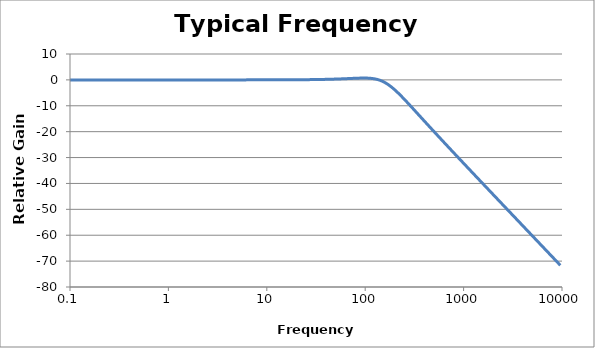
| Category | Relative Gain (dB) |
|---|---|
| 0.1 | 0 |
| 0.10391223 | 0 |
| 0.10797752 | 0 |
| 0.11220184999999999 | 0 |
| 0.11659144 | 0 |
| 0.12115277 | 0 |
| 0.12589254 | 0 |
| 0.13081774999999998 | 0 |
| 0.13593564 | 0 |
| 0.14125374999999998 | 0 |
| 0.14677993 | 0 |
| 0.1525223 | 0 |
| 0.15848932 | 0 |
| 0.16468978999999997 | 0 |
| 0.17113283 | 0 |
| 0.17782794000000002 | 0 |
| 0.18478498 | 0 |
| 0.19201419 | 0 |
| 0.19952623 | 0 |
| 0.20733216 | 0 |
| 0.21544347 | 0 |
| 0.22387210999999999 | 0 |
| 0.23263050999999998 | 0 |
| 0.24173155 | 0 |
| 0.25118864 | 0 |
| 0.26101572 | 0 |
| 0.27122726 | 0 |
| 0.28183829 | 0 |
| 0.29286446 | 0 |
| 0.30432199000000004 | 0 |
| 0.31622777 | 0 |
| 0.32859932 | 0 |
| 0.34145488999999996 | 0 |
| 0.35481339 | 0 |
| 0.36869451 | 0 |
| 0.38311868 | 0 |
| 0.39810717 | 0 |
| 0.41368204 | 0 |
| 0.42986622999999996 | 0 |
| 0.44668358999999996 | 0 |
| 0.46415888 | 0 |
| 0.48231785000000005 | 0 |
| 0.50118723 | 0 |
| 0.52079483 | 0 |
| 0.54116953 | 0 |
| 0.56234133 | 0 |
| 0.58434141 | 0 |
| 0.6072021999999999 | 0 |
| 0.63095734 | 0 |
| 0.65564185 | 0 |
| 0.6812920699999999 | 0 |
| 0.70794578 | 0 |
| 0.7356422499999999 | 0 |
| 0.7644222700000001 | 0 |
| 0.79432823 | 0 |
| 0.82540419 | 0 |
| 0.8576959000000001 | 0 |
| 0.89125094 | 0 |
| 0.92611873 | 0 |
| 0.96235063 | 0 |
| 1.0 | 0 |
| 1.0391223 | 0 |
| 1.0797751599999998 | 0 |
| 1.1220184500000001 | 0 |
| 1.1659144 | 0 |
| 1.21152766 | 0 |
| 1.25892541 | 0 |
| 1.3081774700000002 | 0 |
| 1.3593563899999999 | 0 |
| 1.41253754 | 0 |
| 1.46779927 | 0 |
| 1.52522296 | 0 |
| 1.58489319 | 0 |
| 1.64689787 | 0 |
| 1.7113283 | 0 |
| 1.7782794100000001 | 0 |
| 1.8478497999999999 | 0 |
| 1.92014194 | 0.001 |
| 1.99526231 | 0.001 |
| 2.07332157 | 0.001 |
| 2.15443469 | 0.001 |
| 2.23872114 | 0.001 |
| 2.32630507 | 0.001 |
| 2.41731548 | 0.001 |
| 2.51188643 | 0.001 |
| 2.61015722 | 0.001 |
| 2.71227258 | 0.001 |
| 2.8183829300000003 | 0.001 |
| 2.9286445600000004 | 0.001 |
| 3.04321989 | 0.001 |
| 3.16227766 | 0.001 |
| 3.28599325 | 0.002 |
| 3.41454887 | 0.002 |
| 3.54813389 | 0.002 |
| 3.68694506 | 0.002 |
| 3.83118685 | 0.002 |
| 3.98107171 | 0.002 |
| 4.1368203999999995 | 0.002 |
| 4.29866235 | 0.003 |
| 4.46683592 | 0.003 |
| 4.64158883 | 0.003 |
| 4.823178479999999 | 0.003 |
| 5.01187234 | 0.003 |
| 5.20794833 | 0.004 |
| 5.41169527 | 0.004 |
| 5.62341325 | 0.004 |
| 5.84341413 | 0.005 |
| 6.07202196 | 0.005 |
| 6.30957344 | 0.006 |
| 6.55641849 | 0.006 |
| 6.81292069 | 0.006 |
| 7.07945784 | 0.007 |
| 7.35642254 | 0.008 |
| 7.64422274 | 0.008 |
| 7.9432823500000005 | 0.009 |
| 8.25404185 | 0.009 |
| 8.57695899 | 0.01 |
| 8.91250938 | 0.011 |
| 9.26118728 | 0.012 |
| 9.623506260000001 | 0.013 |
| 10.0 | 0.014 |
| 10.391223040000002 | 0.015 |
| 10.79775162 | 0.016 |
| 11.22018454 | 0.017 |
| 11.65914401 | 0.019 |
| 12.115276589999999 | 0.02 |
| 12.58925412 | 0.022 |
| 13.08177474 | 0.024 |
| 13.59356391 | 0.025 |
| 14.12537545 | 0.028 |
| 14.67799268 | 0.03 |
| 15.252229569999999 | 0.032 |
| 15.84893192 | 0.035 |
| 16.46897865 | 0.037 |
| 17.11328304 | 0.04 |
| 17.7827941 | 0.043 |
| 18.47849797 | 0.047 |
| 19.201419389999998 | 0.05 |
| 19.95262315 | 0.054 |
| 20.73321573 | 0.059 |
| 21.5443469 | 0.063 |
| 22.38721139 | 0.068 |
| 23.263050670000002 | 0.074 |
| 24.17315481 | 0.079 |
| 25.11886432 | 0.086 |
| 26.10157216 | 0.092 |
| 27.12272579 | 0.099 |
| 28.18382931 | 0.107 |
| 29.28644565 | 0.115 |
| 30.43219887 | 0.124 |
| 31.6227766 | 0.134 |
| 32.859932480000005 | 0.144 |
| 34.14548874 | 0.155 |
| 35.48133892 | 0.166 |
| 36.86945065 | 0.179 |
| 38.311868499999996 | 0.192 |
| 39.81071706 | 0.206 |
| 41.36820402 | 0.222 |
| 42.98662347 | 0.238 |
| 44.66835922 | 0.255 |
| 46.415888339999995 | 0.273 |
| 48.23178482 | 0.293 |
| 50.118723360000004 | 0.313 |
| 52.07948329 | 0.335 |
| 54.11695265 | 0.358 |
| 56.234132519999996 | 0.382 |
| 58.434141340000004 | 0.407 |
| 60.72021957 | 0.433 |
| 63.09573445 | 0.46 |
| 65.56418494 | 0.487 |
| 68.12920691 | 0.515 |
| 70.79457844 | 0.544 |
| 73.56422545 | 0.572 |
| 76.44222743 | 0.599 |
| 79.43282347 | 0.626 |
| 82.54041853 | 0.65 |
| 85.76958986 | 0.672 |
| 89.12509381000001 | 0.69 |
| 92.61187281 | 0.703 |
| 96.23506264000001 | 0.709 |
| 100.0 | 0.706 |
| 103.91223038 | 0.693 |
| 107.97751622999999 | 0.666 |
| 112.20184543 | 0.623 |
| 116.59144012 | 0.561 |
| 121.15276586 | 0.476 |
| 125.89254118 | 0.365 |
| 130.81774743 | 0.224 |
| 135.93563909000002 | 0.05 |
| 141.25375446 | -0.16 |
| 146.77992676 | -0.409 |
| 152.52229565 | -0.698 |
| 158.48931925 | -1.029 |
| 164.68978654999998 | -1.402 |
| 171.13283042 | -1.815 |
| 177.82794099999998 | -2.268 |
| 184.78497974 | -2.757 |
| 192.01419386 | -3.279 |
| 199.5262315 | -3.832 |
| 207.33215735 | -4.411 |
| 215.44346900000002 | -5.013 |
| 223.87211386 | -5.635 |
| 232.63050672 | -6.273 |
| 241.73154808 | -6.925 |
| 251.18864315 | -7.588 |
| 261.01572157 | -8.259 |
| 271.22725793 | -8.938 |
| 281.83829313 | -9.622 |
| 292.86445646000004 | -10.31 |
| 304.32198871 | -11.001 |
| 316.22776602 | -11.694 |
| 328.59932476 | -12.389 |
| 341.45488737999995 | -13.083 |
| 354.81338923 | -13.778 |
| 368.69450645 | -14.473 |
| 383.11868496 | -15.167 |
| 398.10717055 | -15.861 |
| 413.68204024 | -16.554 |
| 429.86623471 | -17.246 |
| 446.68359215 | -17.936 |
| 464.15888336 | -18.626 |
| 482.31784822 | -19.314 |
| 501.18723363 | -20.002 |
| 520.79483286 | -20.688 |
| 541.16952655 | -21.373 |
| 562.34132519 | -22.057 |
| 584.3414133699999 | -22.74 |
| 607.2021956899999 | -23.422 |
| 630.95734448 | -24.103 |
| 655.64184942 | -24.783 |
| 681.29206906 | -25.462 |
| 707.94578438 | -26.141 |
| 735.64225446 | -26.818 |
| 764.42227425 | -27.495 |
| 794.32823472 | -28.172 |
| 825.40418527 | -28.847 |
| 857.69589859 | -29.522 |
| 891.25093813 | -30.197 |
| 926.1187281299999 | -30.87 |
| 962.3506263999999 | -31.544 |
| 1000.0 | -32.217 |
| 1039.12 | -32.889 |
| 1079.78 | -33.561 |
| 1122.02 | -34.233 |
| 1165.91 | -34.904 |
| 1211.53 | -35.575 |
| 1258.93 | -36.246 |
| 1308.18 | -36.916 |
| 1359.36 | -37.586 |
| 1412.54 | -38.256 |
| 1467.8 | -38.926 |
| 1525.22 | -39.595 |
| 1584.89 | -40.264 |
| 1646.9 | -40.933 |
| 1711.33 | -41.602 |
| 1778.28 | -42.271 |
| 1847.85 | -42.94 |
| 1920.14 | -43.608 |
| 1995.26 | -44.276 |
| 2073.32 | -44.944 |
| 2154.43 | -45.612 |
| 2238.72 | -46.28 |
| 2326.31 | -46.948 |
| 2417.32 | -47.616 |
| 2511.89 | -48.284 |
| 2610.16 | -48.951 |
| 2712.27 | -49.619 |
| 2818.38 | -50.286 |
| 2928.64 | -50.954 |
| 3043.22 | -51.621 |
| 3162.28 | -52.289 |
| 3285.99 | -52.956 |
| 3414.55 | -53.623 |
| 3548.13 | -54.29 |
| 3686.95 | -54.957 |
| 3831.19 | -55.624 |
| 3981.07 | -56.292 |
| 4136.82 | -56.959 |
| 4298.66 | -57.626 |
| 4466.84 | -58.293 |
| 4641.59 | -58.96 |
| 4823.18 | -59.627 |
| 5011.87 | -60.293 |
| 5207.95 | -60.96 |
| 5411.7 | -61.627 |
| 5623.41 | -62.294 |
| 5843.41 | -62.961 |
| 6072.02 | -63.628 |
| 6309.57 | -64.295 |
| 6556.42 | -64.961 |
| 6812.92 | -65.628 |
| 7079.46 | -66.295 |
| 7356.42 | -66.962 |
| 7644.22 | -67.629 |
| 7943.28 | -68.295 |
| 8254.04 | -68.962 |
| 8576.96 | -69.629 |
| 8912.51 | -70.296 |
| 9261.19 | -70.962 |
| 9623.51 | -71.629 |